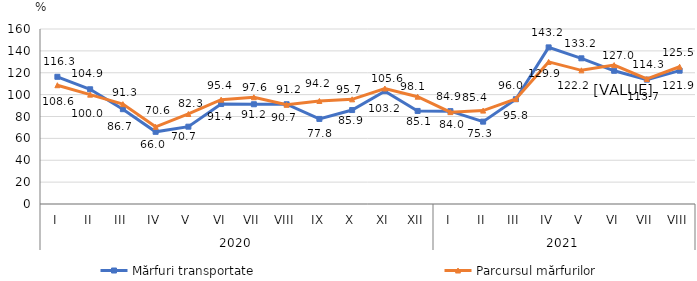
| Category | Mărfuri transportate | Parcursul mărfurilor |
|---|---|---|
| 0 | 116.3 | 108.6 |
| 1 | 104.9 | 100 |
| 2 | 86.7 | 91.3 |
| 3 | 66 | 70.6 |
| 4 | 70.7 | 82.3 |
| 5 | 91.4 | 95.4 |
| 6 | 91.2 | 97.6 |
| 7 | 91.2 | 90.7 |
| 8 | 77.8 | 94.2 |
| 9 | 85.9 | 95.7 |
| 10 | 103.2 | 105.6 |
| 11 | 85.1 | 98.1 |
| 12 | 84.9 | 84 |
| 13 | 75.3 | 85.4 |
| 14 | 95.8 | 96 |
| 15 | 143.2 | 129.9 |
| 16 | 133.2 | 122.2 |
| 17 | 121.8 | 127 |
| 18 | 113.7 | 114.3 |
| 19 | 121.9 | 125.5 |